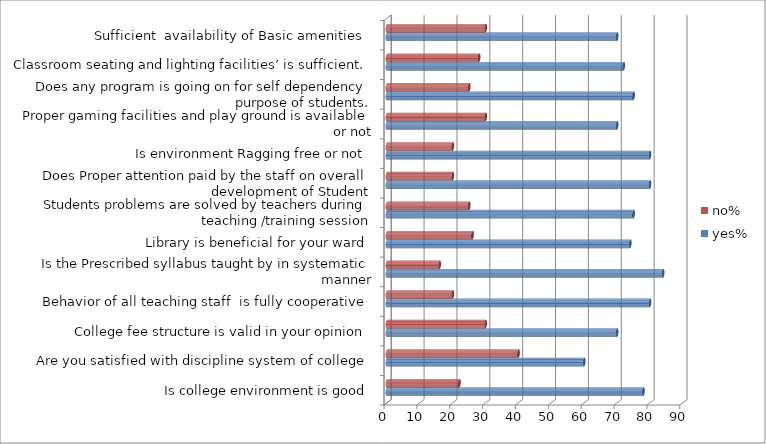
| Category | yes% | no% |
|---|---|---|
| Is college environment is good | 78 | 22 |
| Are you satisfied with discipline system of college | 60 | 40 |
| College fee structure is valid in your opinion | 70 | 30 |
| Behavior of all teaching staff  is fully cooperative | 80 | 20 |
| Is the Prescribed syllabus taught by in systematic manner | 84 | 16 |
| Library is beneficial for your ward | 74 | 26 |
| Students problems are solved by teachers during teaching /training session | 75 | 25 |
| Does Proper attention paid by the staff on overall development of Student | 80 | 20 |
| Is environment Ragging free or not | 80 | 20 |
| Proper gaming facilities and play ground is available or not | 70 | 30 |
| Does any program is going on for self dependency purpose of students. | 75 | 25 |
| Classroom seating and lighting facilities’ is sufficient. | 72 | 28 |
| Sufficient  availability of Basic amenities  | 70 | 30 |